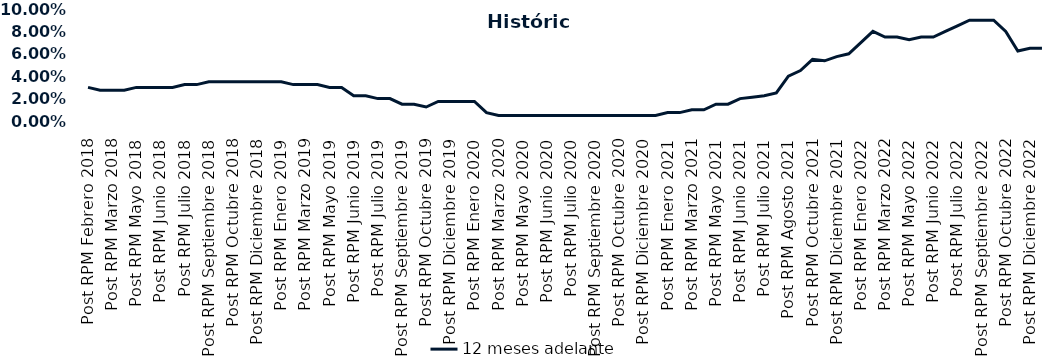
| Category | 12 meses adelante  |
|---|---|
| Post RPM Febrero 2018 | 0.03 |
| Pre RPM Marzo 2018 | 0.028 |
| Post RPM Marzo 2018 | 0.028 |
| Pre RPM Mayo 2018 | 0.028 |
| Post RPM Mayo 2018 | 0.03 |
| Pre RPM Junio 2018 | 0.03 |
| Post RPM Junio 2018 | 0.03 |
| Pre RPM Julio 2018 | 0.03 |
| Post RPM Julio 2018 | 0.032 |
| Pre RPM Septiembre 2018 | 0.032 |
| Post RPM Septiembre 2018 | 0.035 |
| Pre RPM Octubre 2018 | 0.035 |
| Post RPM Octubre 2018 | 0.035 |
| Pre RPM Diciembre 2018 | 0.035 |
| Post RPM Diciembre 2018 | 0.035 |
| Pre RPM Enero 2019 | 0.035 |
| Post RPM Enero 2019 | 0.035 |
| Pre RPM Marzo 2019 | 0.032 |
| Post RPM Marzo 2019 | 0.032 |
| Pre RPM Mayo 2019 | 0.032 |
| Post RPM Mayo 2019 | 0.03 |
| Pre RPM Junio 2019 | 0.03 |
| Post RPM Junio 2019 | 0.022 |
| Pre RPM Julio 2019 | 0.022 |
| Post RPM Julio 2019 | 0.02 |
| Pre RPM Septiembre 2019 | 0.02 |
| Post RPM Septiembre 2019 | 0.015 |
| Pre RPM Octubre 2019 | 0.015 |
| Post RPM Octubre 2019 | 0.012 |
| Pre RPM Diciembre 2019 | 0.018 |
| Post RPM Diciembre 2019 | 0.018 |
| Pre RPM Enero 2020 | 0.018 |
| Post RPM Enero 2020 | 0.018 |
| Pre RPM Marzo 2020 | 0.008 |
| Post RPM Marzo 2020 | 0.005 |
| Pre RPM Mayo 2020 | 0.005 |
| Post RPM Mayo 2020 | 0.005 |
| Pre RPM Junio 2020 | 0.005 |
| Post RPM Junio 2020 | 0.005 |
| Pre RPM Julio 2020 | 0.005 |
| Post RPM Julio 2020 | 0.005 |
| Pre RPM Septiembre 2020 | 0.005 |
| Post RPM Septiembre 2020 | 0.005 |
| Pre RPM Octubre 2020 | 0.005 |
| Post RPM Octubre 2020 | 0.005 |
| Pre RPM Diciembre 2020 | 0.005 |
| Post RPM Diciembre 2020 | 0.005 |
| Pre RPM Enero 2021 | 0.005 |
| Post RPM Enero 2021 | 0.008 |
| Pre RPM Marzo 2021 | 0.008 |
| Post RPM Marzo 2021 | 0.01 |
| Pre RPM Mayo 2021 | 0.01 |
| Post RPM Mayo 2021 | 0.015 |
| Pre RPM Junio 2021 | 0.015 |
| Post RPM Junio 2021 | 0.02 |
| Pre RPM Julio 2021 | 0.021 |
| Post RPM Julio 2021 | 0.022 |
| Pre RPM Agosto 2021 | 0.025 |
| Post RPM Agosto 2021 | 0.04 |
| Pre RPM Octubre 2021 | 0.045 |
| Post RPM Octubre 2021 | 0.055 |
| Pre RPM Diciembre 2021 | 0.054 |
| Post RPM Diciembre 2021 | 0.058 |
| Pre RPM Enero 2022 | 0.06 |
| Post RPM Enero 2022 | 0.07 |
| Pre RPM Marzo 2022 | 0.08 |
| Post RPM Marzo 2022 | 0.075 |
| Pre RPM Mayo 2022 | 0.075 |
| Post RPM Mayo 2022 | 0.072 |
| Pre RPM Junio 2022 | 0.075 |
| Post RPM Junio 2022 | 0.075 |
| Pre RPM Julio 2022 | 0.08 |
| Post RPM Julio 2022 | 0.085 |
| Pre RPM Septiembre 2022 | 0.09 |
| Post RPM Septiembre 2022 | 0.09 |
| Pre RPM Octubre 2022 | 0.09 |
| Post RPM Octubre 2022 | 0.08 |
| Pre RPM Diciembre 2022 | 0.062 |
| Post RPM Diciembre 2022 | 0.065 |
| Pre RPM Enero 2023 | 0.065 |